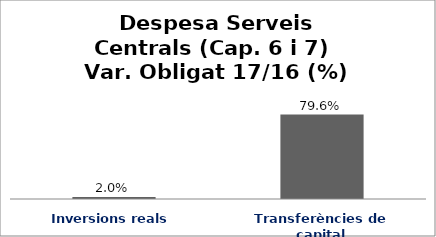
| Category | Series 0 |
|---|---|
| Inversions reals | 0.02 |
| Transferències de capital | 0.796 |